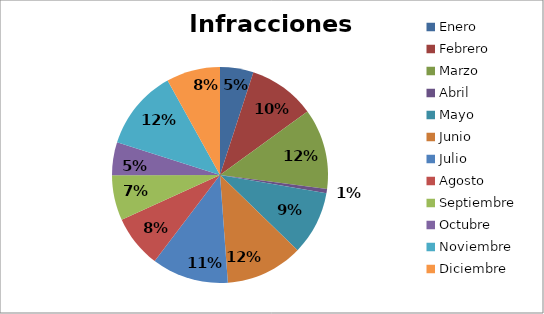
| Category | Series 0 |
|---|---|
| Enero  | 0.05 |
| Febrero  | 0.1 |
| Marzo | 0.12 |
| Abril | 0.006 |
| Mayo | 0.095 |
| Junio | 0.116 |
| Julio | 0.115 |
| Agosto | 0.079 |
| Septiembre | 0.068 |
| Octubre | 0.049 |
| Noviembre | 0.12 |
| Diciembre | 0.081 |